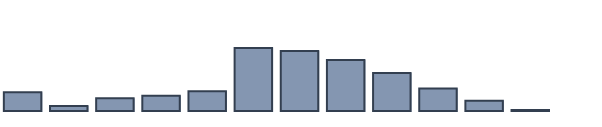
| Category | Series 0 |
|---|---|
| 0 | 5.9 |
| 1 | 1.6 |
| 2 | 4 |
| 3 | 4.8 |
| 4 | 6.2 |
| 5 | 19.9 |
| 6 | 18.9 |
| 7 | 16.1 |
| 8 | 12 |
| 9 | 7.1 |
| 10 | 3.2 |
| 11 | 0.3 |
| 12 | 0 |